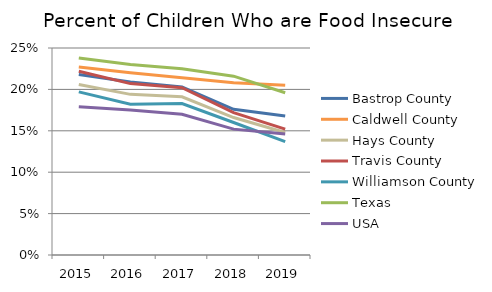
| Category | Bastrop County | Caldwell County | Hays County | Travis County | Williamson County | Texas | USA |
|---|---|---|---|---|---|---|---|
| 2015.0 | 0.218 | 0.227 | 0.206 | 0.222 | 0.197 | 0.238 | 0.179 |
| 2016.0 | 0.209 | 0.22 | 0.194 | 0.207 | 0.182 | 0.23 | 0.175 |
| 2017.0 | 0.203 | 0.214 | 0.191 | 0.202 | 0.183 | 0.225 | 0.17 |
| 2018.0 | 0.176 | 0.208 | 0.166 | 0.172 | 0.16 | 0.216 | 0.152 |
| 2019.0 | 0.168 | 0.205 | 0.148 | 0.152 | 0.137 | 0.196 | 0.146 |